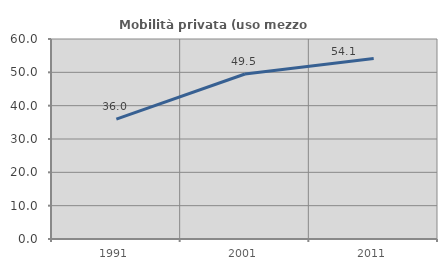
| Category | Mobilità privata (uso mezzo privato) |
|---|---|
| 1991.0 | 35.953 |
| 2001.0 | 49.505 |
| 2011.0 | 54.131 |